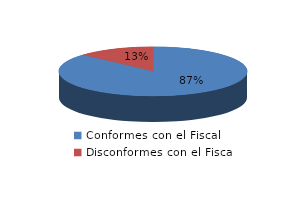
| Category | Series 0 |
|---|---|
| 0 | 150 |
| 1 | 23 |